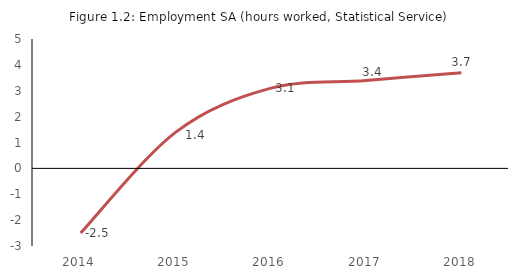
| Category | Employment SA (hours worked, Statistical Service) |
|---|---|
| 2014.0 | -2.5 |
| 2015.0 | 1.4 |
| 2016.0 | 3.1 |
| 2017.0 | 3.4 |
| 2018.0 | 3.7 |